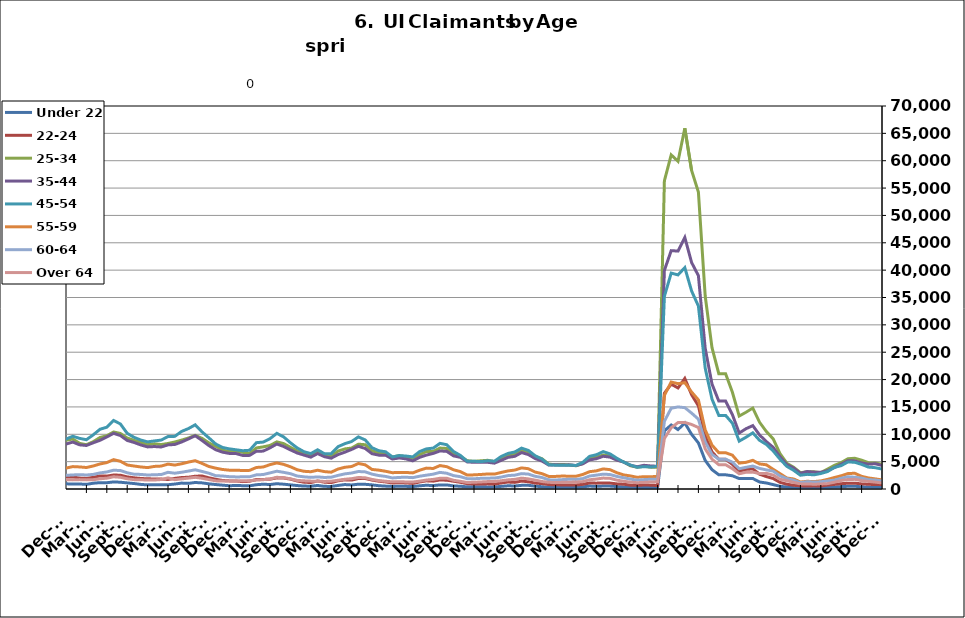
| Category | Under 22 | 22-24 | 25-34 | 35-44 | 45-54 | 55-59 | 60-64 | Over 64 |
|---|---|---|---|---|---|---|---|---|
| 1995-02-28 | 535 | 933 | 5740 | 6206 | 4029 | 1255 | 625 | 276 |
| 1995-03-31 | 534 | 992 | 5856 | 6433 | 4297 | 1294 | 686 | 323 |
| 1995-04-30 | 603 | 1125 | 6814 | 6965 | 4447 | 1392 | 730 | 338 |
| 1995-05-31 | 626 | 1171 | 7442 | 7404 | 4702 | 1383 | 751 | 333 |
| 1995-06-30 | 625 | 1218 | 7514 | 7778 | 4867 | 1435 | 813 | 366 |
| 1995-07-31 | 710 | 1296 | 8612 | 8864 | 5537 | 1595 | 891 | 407 |
| 1995-08-31 | 729 | 1248 | 8185 | 8719 | 5400 | 1604 | 982 | 406 |
| 1995-09-30 | 578 | 1028 | 6615 | 7150 | 4534 | 1351 | 862 | 338 |
| 1995-10-31 | 554 | 957 | 5805 | 6461 | 4159 | 1205 | 741 | 287 |
| 1995-11-30 | 468 | 845 | 5201 | 5826 | 3927 | 1155 | 702 | 254 |
| 1995-12-31 | 517 | 858 | 5350 | 5974 | 4010 | 1153 | 672 | 263 |
| 1996-01-31 | 543 | 927 | 5431 | 6086 | 4208 | 1221 | 685 | 301 |
| 1996-02-29 | 617 | 999 | 5667 | 6535 | 4480 | 1312 | 747 | 305 |
| 1996-03-31 | 622 | 981 | 5896 | 6557 | 4514 | 1362 | 763 | 306 |
| 1996-04-30 | 680 | 1140 | 7032 | 7649 | 5088 | 1527 | 856 | 345 |
| 1996-05-31 | 689 | 1163 | 7220 | 7819 | 5070 | 1521 | 832 | 366 |
| 1996-06-30 | 661 | 1145 | 7344 | 8173 | 5391 | 1568 | 844 | 388 |
| 1996-07-31 | 762 | 1250 | 8375 | 9181 | 6036 | 1755 | 973 | 432 |
| 1996-08-31 | 746 | 1145 | 7829 | 8585 | 5586 | 1651 | 950 | 435 |
| 1996-09-30 | 635 | 992 | 6399 | 7097 | 4790 | 1462 | 804 | 425 |
| 1996-10-31 | 572 | 851 | 5448 | 6291 | 4192 | 1259 | 693 | 340 |
| 1996-11-30 | 531 | 827 | 5003 | 5921 | 3908 | 1153 | 602 | 315 |
| 1996-12-31 | 521 | 789 | 4710 | 5510 | 3673 | 1110 | 610 | 284 |
| 1997-01-31 | 559 | 841 | 5203 | 6172 | 4321 | 1255 | 731 | 328 |
| 1997-02-28 | 556 | 841 | 5187 | 6162 | 4311 | 1250 | 727 | 326 |
| 1997-03-31 | 499 | 806 | 5125 | 6037 | 4176 | 1294 | 702 | 363 |
| 1997-04-30 | 545 | 885 | 5753 | 6709 | 4248 | 1339 | 734 | 339 |
| 1997-05-31 | 612 | 941 | 6146 | 7153 | 4458 | 1348 | 801 | 336 |
| 1997-06-30 | 623 | 995 | 6240 | 7298 | 4662 | 1302 | 776 | 348 |
| 1997-07-31 | 716 | 1154 | 7168 | 8554 | 5489 | 1509 | 903 | 415 |
| 1997-08-31 | 684 | 1072 | 6853 | 8093 | 5222 | 1487 | 837 | 416 |
| 1997-09-30 | 579 | 912 | 5522 | 6592 | 4348 | 1285 | 705 | 380 |
| 1997-10-31 | 516 | 817 | 4894.5 | 5892.5 | 3945 | 1159 | 625 | 344.5 |
| 1997-11-30 | 453 | 722 | 4267 | 5193 | 3542 | 1033 | 545 | 309 |
| 1997-12-31 | 413 | 682 | 3792 | 4755 | 3300 | 1023 | 490 | 266 |
| 1998-01-31 | 489 | 741 | 4044 | 5115 | 3513 | 1099 | 525 | 267 |
| 1998-02-28 | 435 | 684 | 3864 | 4903 | 3549 | 1043 | 571 | 285 |
| 1998-03-31 | 416 | 680 | 3855 | 5086 | 3703 | 1176 | 604 | 297 |
| 1998-04-30 | 592 | 813 | 5092 | 6219 | 4262 | 1336 | 688 | 332 |
| 1998-05-31 | 579 | 849 | 5319 | 6766 | 4554 | 1382 | 729 | 360 |
| 1998-06-30 | 568 | 899 | 5557 | 7101 | 4897 | 1405 | 783 | 367 |
| 1998-07-31 | 691 | 1031 | 6472 | 8095 | 5562 | 1589 | 880 | 392 |
| 1998-08-31 | 673 | 1007 | 6326 | 7950 | 5369 | 1574 | 935 | 393 |
| 1998-09-30 | 548 | 838 | 5206 | 6768 | 4703 | 1432 | 849 | 373 |
| 1998-10-31 | 496 | 776 | 4437 | 5582 | 3875 | 1250 | 711 | 302 |
| 1998-11-30 | 456 | 761 | 4182 | 5332 | 4015 | 1296 | 694 | 308 |
| 1998-12-31 | 442 | 722 | 4010 | 5198 | 4062 | 1331 | 656 | 290 |
| 1999-01-31 | 503 | 830 | 4502 | 5761 | 4521 | 1490 | 751 | 297 |
| 1999-02-28 | 463 | 756 | 4267 | 5576 | 4431 | 1470 | 767 | 301 |
| 1999-03-31 | 435 | 688 | 4119 | 5519 | 4403 | 1516 | 765 | 331 |
| 1999-04-30 | 591 | 949 | 5292 | 7089 | 5468 | 1724 | 914 | 489 |
| 1999-05-31 | 674 | 911 | 5611 | 7459 | 5457 | 1710 | 934 | 500 |
| 1999-06-30 | 640 | 906 | 5660 | 7503 | 5333 | 1695 | 920 | 495 |
| 1999-07-31 | 766 | 1132 | 6820 | 9256 | 6620 | 1981 | 1001 | 549 |
| 1999-08-31 | 738 | 1117 | 6737 | 9030 | 6670 | 2019 | 1075 | 582 |
| 1999-09-30 | 600 | 968 | 5167 | 7169 | 5458 | 1712 | 892 | 465 |
| 1999-10-31 | 494 | 813 | 4501 | 6048 | 4682 | 1443 | 743 | 363 |
| 1999-11-30 | 464 | 768 | 4228 | 5593 | 4564 | 1392 | 702 | 313 |
| 1999-12-31 | 468.5 | 754.5 | 4149 | 5486.5 | 4505 | 1429 | 673 | 304 |
| 2000-01-31 | 473 | 741 | 4070 | 5380 | 4446 | 1466 | 644 | 295 |
| 2000-02-29 | 460 | 691 | 3807 | 5357 | 4470 | 1469 | 707 | 310 |
| 2000-03-31 | 412 | 652 | 3864 | 5499 | 4568 | 1508 | 816 | 389 |
| 2000-04-30 | 585 | 829 | 4741 | 6891 | 5127 | 1631 | 906 | 451 |
| 2000-05-31 | 627 | 875 | 5086 | 7211 | 5238 | 1598 | 956 | 489 |
| 2000-06-30 | 675 | 983 | 5624 | 7826 | 5562 | 1669 | 941 | 524 |
| 2000-07-31 | 802 | 1109 | 6475 | 9102 | 6450 | 1927 | 1097 | 594 |
| 2000-08-31 | 787 | 1058 | 6045 | 8732 | 6157 | 1894 | 1085 | 616 |
| 2000-09-30 | 607 | 897 | 4766 | 6864 | 5037 | 1486 | 902 | 479 |
| 2000-10-31 | 544 | 760 | 4267 | 5897 | 4465 | 1323 | 762 | 394 |
| 2000-11-30 | 535 | 797 | 3982 | 5439 | 4318 | 1256 | 702 | 396 |
| 2000-12-31 | 508 | 832 | 3891 | 5255 | 4218 | 1246 | 694 | 361 |
| 2001-01-31 | 627 | 892 | 4229 | 5724 | 4777 | 1300 | 721 | 393 |
| 2001-02-28 | 643 | 934 | 4553 | 6302 | 5224 | 1529 | 849 | 472 |
| 2001-03-31 | 412 | 648 | 3625 | 5081 | 4551 | 1413 | 778 | 440 |
| 2001-04-30 | 875 | 1276 | 6577 | 8914 | 7196 | 2144 | 1185 | 639 |
| 2001-05-31 | 944 | 1399 | 7133 | 9570 | 7651 | 2265 | 1231 | 679 |
| 2001-06-30 | 1041 | 1584 | 8072 | 11034 | 8621 | 2613 | 1398 | 756 |
| 2001-07-31 | 1135 | 1806 | 9038 | 12514 | 9691 | 2970 | 1611 | 848 |
| 2001-08-31 | 1116 | 1776 | 8753 | 12045 | 9560 | 2963 | 1691 | 898 |
| 2001-09-30 | 1046 | 1705 | 8118 | 11025 | 8788 | 2784 | 1608 | 833 |
| 2001-10-31 | 1094 | 1785 | 8459 | 11114 | 8850 | 2772 | 1610 | 777 |
| 2001-11-30 | 1154 | 1931 | 9131 | 11576 | 9447 | 2973 | 1661 | 778 |
| 2001-12-31 | 1280 | 2191 | 9917 | 11961 | 9905 | 3152 | 1740 | 780 |
| 2002-01-31 | 1330 | 2255 | 10364 | 12730 | 10592 | 3378 | 1843 | 821 |
| 2002-02-28 | 1347 | 2339 | 10349 | 12730 | 10784 | 3499 | 1861 | 867 |
| 2002-03-31 | 1266 | 2231 | 9963 | 12747 | 10614 | 3499 | 1867 | 979 |
| 2002-04-30 | 1412 | 2488 | 11603 | 15825 | 13571 | 4631 | 2389 | 1146 |
| 2002-05-31 | 1455 | 2421 | 11243 | 15509 | 13148 | 4374 | 2359 | 1195 |
| 2002-06-30 | 1534 | 2479 | 11416 | 15594 | 13261 | 4343 | 2365 | 1180 |
| 2002-07-31 | 1513 | 2614 | 11895 | 16242 | 13727 | 4439 | 2428 | 1255 |
| 2002-08-31 | 1022 | 1977 | 8719 | 12054 | 10588 | 3454 | 1990 | 1047 |
| 2002-09-30 | 1391 | 2528 | 10478 | 14010 | 12008 | 3847 | 2161 | 1166 |
| 2002-10-31 | 1401 | 2385 | 9826 | 12727 | 10778 | 3498 | 1886 | 973 |
| 2002-11-30 | 1344 | 2390 | 9846 | 12059 | 10297 | 3367 | 1833 | 958 |
| 2002-12-31 | 1311 | 2403 | 9841 | 11670 | 10177 | 3369 | 1871 | 894 |
| 2003-01-31 | 1311 | 2403 | 9841 | 11670 | 10177 | 3369 | 1871 | 894 |
| 2003-02-28 | 1367 | 2275 | 9730 | 12433 | 10806 | 3687 | 2016 | 974 |
| 2003-03-31 | 1367 | 2357 | 9844 | 12620 | 11167 | 3825 | 2151 | 1094 |
| 2003-04-30 | 1549 | 2525 | 10619 | 14142 | 12182 | 4004 | 2304 | 1190 |
| 2003-05-31 | 1663 | 2698 | 10843 | 14795 | 12539 | 4102 | 2395 | 1256 |
| 2003-06-30 | 1755 | 2770 | 11350 | 15575 | 13251 | 4301 | 2493 | 1325 |
| 2003-07-31 | 1748 | 2791 | 11577 | 15863 | 13772 | 4465 | 2593 | 1371 |
| 2003-08-31 | 1718 | 2653 | 10998 | 15261 | 13219 | 4325 | 2522 | 1359 |
| 2003-09-30 | 1494 | 2521 | 10071 | 13565 | 11659 | 3828 | 2278 | 1286 |
| 2003-10-31 | 1329 | 2432 | 9388 | 12107 | 10693 | 3567 | 2036 | 1129 |
| 2003-11-30 | 1191 | 2226 | 8954 | 11297 | 10037 | 3414 | 2004 | 1068 |
| 2003-12-31 | 1206 | 2184 | 8530 | 10413 | 9335 | 3215 | 1854 | 994 |
| 2004-01-31 | 1216 | 2171 | 8382 | 9858 | 8955 | 2992 | 1736 | 963 |
| 2004-02-29 | 1118 | 1879 | 7614 | 8935 | 8176 | 2761 | 1617 | 943 |
| 2004-03-31 | 1099 | 1749 | 7152 | 8565 | 7769 | 2686 | 1608 | 981 |
| 2004-04-30 | 1241 | 1951 | 7653 | 9981 | 8741 | 2872 | 1685 | 1056 |
| 2004-05-31 | 1245 | 1934 | 7651 | 10203 | 8820 | 2928 | 1703 | 1079 |
| 2004-06-30 | 1316 | 2086 | 8172 | 10636 | 9362 | 3146 | 1843 | 1081 |
| 2004-07-31 | 1476 | 2265 | 8795 | 11511 | 10439 | 3497 | 2008 | 1171 |
| 2004-08-31 | 1390 | 2055 | 8008 | 10418 | 9514 | 3304 | 1909 | 1105 |
| 2004-09-30 | 1129 | 1820 | 6987 | 8661 | 7694 | 2755 | 1623 | 1046 |
| 2004-10-31 | 1037 | 1675 | 6590 | 7964 | 7029 | 2459 | 1461 | 882 |
| 2004-11-30 | 954 | 1638 | 6342 | 7570 | 6733 | 2294 | 1383 | 841 |
| 2004-12-31 | 857 | 1533 | 5921 | 6991 | 6333 | 2225 | 1287 | 764 |
| 2005-01-31 | 893 | 1539 | 6047 | 7410 | 6682 | 2253 | 1274 | 788 |
| 2005-02-28 | 846 | 1361 | 5650 | 6952 | 6404 | 2198 | 1326 | 786 |
| 2005-03-31 | 747 | 1258 | 5313 | 6595 | 6251 | 2151 | 1327 | 742 |
| 2005-04-30 | 877 | 1375 | 5696 | 7717 | 7230 | 2440 | 1401 | 844 |
| 2005-05-31 | 854 | 1408 | 5674 | 7905 | 7454 | 2482 | 1453 | 858 |
| 2005-06-30 | 819 | 1444 | 6028 | 8565 | 7899 | 2613 | 1547 | 890 |
| 2005-07-31 | 900 | 1461 | 6395 | 9124 | 8614 | 2864 | 1640 | 1004 |
| 2005-08-31 | 805 | 1439 | 5917 | 8271 | 8076 | 2692 | 1587 | 945 |
| 2005-09-30 | 631 | 1209 | 4978 | 6413 | 6203 | 2116 | 1312 | 724 |
| 2005-10-31 | 638 | 1134 | 4602 | 6028 | 5688 | 1997 | 1171 | 656 |
| 2005-11-30 | 564 | 1071 | 4409 | 5563 | 5105 | 1791 | 1035 | 580 |
| 2005-12-31 | 523 | 987 | 4014 | 4983 | 4531 | 1673 | 968 | 546 |
| 2006-01-31 | 531 | 925 | 3900 | 5012 | 4793 | 1691 | 1008 | 539 |
| 2006-02-28 | 447 | 804 | 3534 | 4388 | 4403 | 1586 | 980 | 549 |
| 2006-03-31 | 399 | 785 | 3455 | 4472 | 4584 | 1680 | 1069 | 618 |
| 2006-04-30 | 527 | 945 | 4004 | 5859 | 5921 | 1965 | 1251 | 744 |
| 2006-05-31 | 594 | 964 | 4205 | 6365 | 6369 | 2156 | 1327 | 792 |
| 2006-06-30 | 660 | 1113 | 4742 | 7052 | 7094 | 2386 | 1474 | 933 |
| 2006-07-31 | 771 | 1183 | 5214 | 7974 | 8007 | 2685 | 1635 | 1072 |
| 2006-08-31 | 737 | 1202 | 5116 | 7524 | 7553 | 2671 | 1590 | 1019 |
| 2006-09-30 | 596 | 1086 | 4608 | 6175 | 6389 | 2256 | 1287 | 812 |
| 2006-10-31 | 596 | 1056 | 4585 | 5758 | 5788 | 2026 | 1164 | 696 |
| 2006-11-30 | 542 | 1003 | 4370 | 5304 | 5388 | 1812 | 1082 | 604 |
| 2006-12-31 | 553 | 1102 | 4425 | 5291 | 5310 | 1801 | 1099 | 603 |
| 2007-01-31 | 587 | 1147 | 4542 | 5619 | 5506 | 1920 | 1174 | 663 |
| 2007-02-28 | 544 | 1090 | 4490 | 5562 | 5616 | 1982 | 1260 | 705 |
| 2007-03-31 | 558 | 1089 | 4498 | 5595 | 5708 | 2016 | 1378 | 717 |
| 2007-04-30 | 760 | 1203 | 5015 | 6827 | 6871 | 2316 | 1536 | 856 |
| 2007-05-31 | 806 | 1285 | 5542 | 7679 | 7763 | 2571 | 1719 | 1021 |
| 2007-06-30 | 862 | 1340 | 6100 | 8324 | 8341 | 2812 | 1896 | 1060 |
| 2007-07-31 | 980 | 1524 | 6616 | 9184 | 9522 | 3226 | 2038 | 1250 |
| 2007-08-31 | 950 | 1510 | 6266 | 8359 | 8842 | 3033 | 1949 | 1157 |
| 2007-09-30 | 865 | 1595 | 6213 | 7798 | 7957 | 2790 | 1816 | 1090 |
| 2007-10-31 | 883 | 1517 | 6214 | 7229 | 7503 | 2574 | 1630 | 978 |
| 2007-11-15 | 816 | 1424 | 5981 | 6740 | 6999 | 2468 | 1510 | 860 |
| 2007-12-15 09:36:00 | 851 | 1536 | 6411 | 6986 | 7174 | 2572 | 1584 | 874 |
| 2008-01-14 19:12:00 | 963 | 1628 | 6836 | 7533 | 7742 | 2786 | 1744 | 940 |
| 2008-02-14 04:48:00 | 982 | 1565 | 6847 | 7767 | 8031 | 2958 | 1823 | 985 |
| 2008-03-15 14:24:00 | 1029 | 1666 | 7210 | 8036 | 8353 | 3105 | 1898 | 1085 |
| 2008-04-15 | 1182 | 1889 | 7894 | 9339 | 9822 | 3537 | 2184 | 1246 |
| 2008-05-15 09:36:00 | 1325 | 2099 | 8651 | 10315 | 11003 | 3871 | 2423 | 1448 |
| 2008-06-14 19:12:00 | 1405 | 2238 | 9567 | 11330 | 12040 | 4322 | 2650 | 1572 |
| 2008-07-15 04:48:00 | 1616 | 2488 | 10336 | 12349 | 13396 | 4698 | 3083 | 1801 |
| 2008-08-14 14:24:00 | 1753 | 2665 | 10716 | 12486 | 13444 | 4795 | 3139 | 1802 |
| 2008-09-14 | 1800 | 2924 | 11552 | 12686 | 13602 | 4801 | 3180 | 1811 |
| 2008-10-14 09:36:00 | 1936 | 3131 | 12284 | 13322 | 13831 | 4989 | 3183 | 1808 |
| 2008-11-13 19:12:00 | 2093 | 3414 | 13577 | 14724 | 15130 | 5413 | 3440 | 1946 |
| 2008-12-14 04:48:00 | 2495 | 4020 | 15380 | 16325 | 16846 | 6098 | 3755 | 2155 |
| 2009-01-13 14:24:00 | 3054 | 4678 | 17678 | 18452 | 19095 | 6788 | 4182 | 2364 |
| 2009-02-13 | 3531 | 5304 | 19793 | 20788 | 21601 | 7727 | 4836 | 2718 |
| 2009-03-15 09:36:00 | 3891 | 5925 | 22303 | 23139 | 24352 | 8876 | 5515 | 3141 |
| 2009-04-14 19:12:00 | 4291 | 6403 | 23925 | 25362 | 26817 | 9618 | 6020 | 3494 |
| 2009-05-15 04:48:00 | 4410 | 6521 | 24301 | 25794 | 27238 | 9735 | 6181 | 3529 |
| 2009-06-14 14:24:00 | 4405 | 6853 | 25234 | 26806 | 28296 | 10256 | 6673 | 3804 |
| 2009-07-15 | 4729 | 7280 | 26132 | 27836 | 29724 | 10830 | 6950 | 4125 |
| 2009-08-14 09:36:00 | 4717 | 7069 | 25281 | 26184 | 27877 | 10164 | 6719 | 3918 |
| 2009-09-13 19:12:00 | 4741 | 7291 | 25029 | 24981 | 26018 | 9679 | 6210 | 3594 |
| 2009-10-14 04:48:00 | 4656 | 7051 | 24241 | 23779 | 24730 | 9034 | 5817 | 3422 |
| 2009-11-13 14:24:00 | 4421 | 6817 | 23760 | 22851 | 23515 | 8627 | 5549 | 3297 |
| 2009-12-14 | 4232 | 6586 | 23118 | 22038 | 22501 | 8496 | 5370 | 3295 |
| 2010-01-13 09:36:00 | 4276 | 6583 | 22706 | 21421 | 22132 | 8135 | 5154 | 3134 |
| 2010-02-12 19:12:00 | 4133 | 6142 | 21386 | 20012 | 21036 | 7728 | 5039 | 3047 |
| 2010-03-15 04:48:00 | 3784 | 5822 | 20418 | 19073 | 20556 | 7446 | 4983 | 3062 |
| 2010-04-14 14:24:00 | 3731 | 5751 | 20058 | 19261 | 21012 | 7449 | 5078 | 2936 |
| 2010-05-15 | 3516 | 5553 | 19393 | 18793 | 20409 | 7213 | 4923 | 2915 |
| 2010-06-14 09:36:00 | 3450 | 5640 | 19615 | 19385 | 20781 | 7547 | 5293 | 3043 |
| 2010-07-14 19:12:00 | 3536 | 5781 | 19820 | 19714 | 21269 | 7946 | 5439 | 3330 |
| 2010-08-14 04:48:00 | 3477 | 5590 | 18902 | 18548 | 19686 | 7561 | 5039 | 3181 |
| 2010-09-13 14:24:00 | 3083 | 5332 | 17344 | 16712 | 17408 | 6775 | 4612 | 2859 |
| 2010-10-14 | 3004 | 5138 | 17187 | 16492 | 17042 | 6713 | 4418 | 2779 |
| 2010-11-13 09:36:00 | 2724 | 4771 | 16387 | 15438 | 16061 | 6360 | 4209 | 2601 |
| 2010-12-13 19:12:00 | 2335 | 4159 | 15175 | 14143 | 14646 | 5823 | 4003 | 2480 |
| 2011-01-13 04:48:00 | 2530 | 4343 | 15492 | 14596 | 15561 | 6250 | 4059 | 2487 |
| 2011-02-12 14:24:00 | 2609 | 4202 | 15131 | 14142 | 15320 | 6044 | 4041 | 2517 |
| 2011-03-15 | 2290 | 3998 | 14370 | 13505 | 14523 | 5925 | 3990 | 2470 |
| 2011-04-14 09:36:00 | 2563 | 4190 | 14834 | 14445 | 15508 | 6130 | 3916 | 2488 |
| 2011-05-14 19:12:00 | 2642 | 4217 | 14917 | 14494 | 16051 | 6156 | 4129 | 2602 |
| 2011-06-14 04:48:00 | 2767 | 4676 | 17673 | 17404 | 19563 | 7763 | 5398 | 3653 |
| 2011-07-14 14:24:00 | 3027 | 4815 | 17530 | 17197 | 19880 | 7870 | 5384 | 3686 |
| 2011-08-14 | 2900 | 4498 | 15970 | 15020 | 17035 | 6697 | 4394 | 2956 |
| 2011-09-13 09:36:00 | 2531 | 4156 | 14609 | 13818 | 15092 | 5903 | 3881 | 2687 |
| 2011-10-13 19:12:00 | 2452 | 3959 | 14501 | 13415 | 14565 | 5635 | 3734 | 2491 |
| 2011-11-13 04:48:00 | 2197 | 3615 | 13732 | 12410 | 13698 | 5345 | 3574 | 2339 |
| 2011-12-13 14:24:00 | 1938 | 3290 | 13130 | 11646 | 13054 | 5089 | 3380 | 2177 |
| 2012-01-13 | 2098 | 3424 | 13293 | 11897 | 13400 | 5218 | 3448 | 2197 |
| 2012-02-12 09:36:00 | 2047 | 3428 | 12569 | 11400 | 12931 | 5177 | 3445 | 2212 |
| 2012-03-13 19:12:00 | 1870 | 3252 | 11913 | 10922 | 12476 | 4948 | 3317 | 2155 |
| 2012-04-13 04:48:00 | 2063 | 3590 | 12479 | 11814 | 13464 | 5278 | 3509 | 2287 |
| 2012-05-13 14:24:00 | 2260 | 3828 | 12852 | 12063 | 14139 | 5562 | 3628 | 2485 |
| 2012-06-13 | 2147 | 3747 | 13008 | 12659 | 14694 | 5791 | 3902 | 2736 |
| 2012-07-13 09:36:00 | 2358 | 4087 | 14109 | 13412 | 15770 | 6346 | 4156 | 3086 |
| 2012-08-12 19:12:00 | 1887 | 3284 | 11852 | 11102 | 13153 | 5396 | 3487 | 2583 |
| 2012-09-12 04:48:00 | 1524 | 2903 | 10742 | 10051 | 11393 | 4726 | 3103 | 2327 |
| 2012-10-12 14:24:00 | 1289 | 2603 | 10123 | 9339 | 10510 | 4405 | 2813 | 2032 |
| 2012-11-12 | 945 | 2155 | 8870 | 8273 | 9193 | 3781 | 2520 | 1702 |
| 2012-12-12 09:36:00 | 937 | 2201 | 8913 | 8210 | 9124 | 3816 | 2491 | 1722 |
| 2013-01-11 19:12:00 | 934 | 2199 | 9132 | 8579 | 9635 | 4095 | 2569 | 1667 |
| 2013-02-11 04:48:00 | 915 | 1996 | 8343 | 8072 | 9253 | 4034 | 2623 | 1715 |
| 2013-03-13 14:24:00 | 845 | 1934 | 8092 | 7955 | 9007 | 3929 | 2561 | 1667 |
| 2013-04-13 | 1055 | 2124 | 8637 | 8445 | 9891 | 4204 | 2666 | 1698 |
| 2013-05-13 09:36:00 | 1160 | 2394 | 9413 | 8898 | 10920 | 4574 | 2940 | 1871 |
| 2013-06-12 19:12:00 | 1145 | 2351 | 9732 | 9510 | 11293 | 4830 | 3115 | 1976 |
| 2013-07-13 04:48:00 | 1294 | 2558 | 10421 | 10174 | 12520 | 5363 | 3434 | 2233 |
| 2013-08-12 14:24:00 | 1238 | 2519 | 10150 | 9771 | 11886 | 5067 | 3372 | 2140 |
| 2013-09-12 | 1116 | 2214 | 9323 | 8874 | 10178 | 4389 | 2964 | 1871 |
| 2013-10-12 09:36:00 | 1000 | 2044 | 8893 | 8509 | 9449 | 4200 | 2701 | 1709 |
| 2013-11-11 19:12:00 | 842 | 1927 | 8532 | 8049 | 8950 | 4028 | 2665 | 1675 |
| 2013-12-12 04:48:00 | 753 | 1854 | 8098 | 7692 | 8612 | 3913 | 2557 | 1655 |
| 2014-01-11 14:24:00 | 788 | 1846 | 8270 | 7762 | 8786 | 4128 | 2606 | 1642 |
| 2014-02-11 | 795 | 1817 | 8124 | 7677 | 8944 | 4189 | 2646 | 1728 |
| 2014-03-13 09:36:00 | 782 | 1741 | 8319 | 8063 | 9583 | 4550 | 3048 | 2040 |
| 2014-04-12 19:12:00 | 905 | 1940 | 8594 | 8138 | 9620 | 4372 | 2886 | 1706 |
| 2014-05-13 04:48:00 | 1079 | 2093 | 8933 | 8593 | 10522 | 4609 | 3062 | 1850 |
| 2014-06-12 14:24:00 | 1028 | 2152 | 9323 | 9148 | 11040 | 4920 | 3274 | 1985 |
| 2014-07-13 | 1189 | 2333 | 9808 | 9735 | 11729 | 5171 | 3509 | 2133 |
| 2014-08-14 | 1119 | 2379 | 9259 | 8876 | 10438 | 4678 | 3210 | 1962 |
| 2014-09-13 09:36:00 | 943 | 2048 | 8430 | 7946 | 9358 | 4119 | 2891 | 1734 |
| 2014-10-13 19:12:00 | 816 | 1781 | 7821 | 7185 | 8244 | 3813 | 2437 | 1486 |
| 2014-11-13 04:48:00 | 703 | 1557 | 7150 | 6736 | 7594 | 3571 | 2374 | 1466 |
| 2014-12-13 14:24:00 | 597 | 1482 | 6833 | 6507 | 7340 | 3442 | 2255 | 1458 |
| 2015-01-13 | 646 | 1466 | 6927 | 6477 | 7168 | 3432 | 2210 | 1429 |
| 2015-02-12 09:36:00 | 607 | 1346 | 6696 | 6134 | 6999 | 3383 | 2220 | 1525 |
| 2015-03-14 19:12:00 | 577 | 1416 | 6499 | 6145 | 7077 | 3405 | 2233 | 1530 |
| 2015-04-14 04:48:00 | 784 | 1736 | 7505 | 6901 | 8468 | 3935 | 2586 | 1624 |
| 2015-05-14 14:24:00 | 875 | 1749 | 7696 | 6925 | 8578 | 4020 | 2644 | 1698 |
| 2015-06-14 | 818 | 1789 | 7961 | 7519 | 9200 | 4452 | 2943 | 1839 |
| 2015-07-14 09:36:00 | 966 | 2033 | 8609 | 8223 | 10167 | 4766 | 3254 | 2136 |
| 2015-08-13 19:12:00 | 880 | 2007 | 8302 | 7779 | 9530 | 4503 | 3045 | 2073 |
| 2015-09-13 04:48:00 | 752 | 1807 | 7615 | 7153 | 8455 | 4067 | 2798 | 1870 |
| 2015-10-13 14:24:00 | 630 | 1461 | 6995 | 6578 | 7509 | 3519 | 2375 | 1570 |
| 2015-11-13 | 533 | 1246 | 6491 | 6196 | 6815 | 3237 | 2224 | 1493 |
| 2015-12-13 09:36:00 | 512 | 1179 | 6242 | 5823 | 6474 | 3158 | 2123 | 1439 |
| 2016-01-12 19:12:00 | 646 | 1466 | 6927 | 6477 | 7168 | 3432 | 2210 | 1429 |
| 2016-02-12 04:48:00 | 482 | 1246 | 6101 | 5912 | 6452 | 3180 | 2110 | 1385 |
| 2016-03-13 14:24:00 | 474 | 1170 | 6011 | 5629 | 6452 | 3073 | 2152 | 1420 |
| 2016-04-13 | 648 | 1494 | 6917 | 6287 | 7737 | 3648 | 2483 | 1600 |
| 2016-05-13 09:36:00 | 812 | 1670 | 7326 | 6725 | 8279 | 3967 | 2765 | 1776 |
| 2016-06-12 19:12:00 | 738 | 1622 | 7479 | 7230 | 8681 | 4111 | 2920 | 1886 |
| 2016-07-13 04:48:00 | 875 | 1919 | 8193 | 7814 | 9525 | 4662 | 3196 | 2105 |
| 2016-08-12 14:24:00 | 858 | 1920 | 8091 | 7407 | 8969 | 4420 | 3130 | 2050 |
| 2016-09-12 | 752 | 1632 | 6992 | 6450 | 7548 | 3573 | 2713 | 1747 |
| 2016-10-12 09:36:00 | 602 | 1423 | 6590 | 6190 | 6998 | 3448 | 2457 | 1544 |
| 2016-11-11 19:12:00 | 523 | 1296 | 6418 | 6179 | 6801 | 3241 | 2299 | 1410 |
| 2016-12-12 04:48:00 | 468 | 1096 | 5827 | 5472 | 5867 | 2981 | 2019 | 1311 |
| 2017-01-11 14:24:00 | 495 | 1150 | 6111 | 5679 | 6108 | 3035 | 2115 | 1342 |
| 2017-02-11 | 484 | 1109 | 5882 | 5500 | 6023 | 3023 | 2148 | 1289 |
| 2017-03-13 09:36:00 | 442 | 1015 | 5634 | 5148 | 5865 | 2942 | 2075 | 1278 |
| 2017-04-12 19:12:00 | 585 | 1285 | 6292 | 5783 | 6842 | 3434 | 2336 | 1435 |
| 2017-05-13 04:48:00 | 686 | 1492 | 6844 | 6200 | 7332 | 3817 | 2526 | 1637 |
| 2017-06-12 14:24:00 | 623 | 1435 | 6852 | 6505 | 7473 | 3751 | 2713 | 1754 |
| 2017-07-13 | 745 | 1658 | 7483 | 6953 | 8339 | 4284 | 3038 | 1964 |
| 2017-08-12 09:36:00 | 745 | 1605 | 7411 | 6880 | 8092 | 4080 | 2878 | 1966 |
| 2017-09-11 19:12:00 | 559 | 1420 | 6481 | 6045 | 6845 | 3511 | 2443 | 1591 |
| 2017-10-12 04:48:00 | 503 | 1224 | 5960 | 5790 | 6135 | 3181 | 2245 | 1400 |
| 2017-11-11 14:24:00 | 390 | 972 | 5167 | 4951 | 5077 | 2553 | 1887 | 1188 |
| 2017-12-12 | 413 | 914 | 5058 | 4876 | 5071 | 2585 | 1870 | 1226 |
| 2018-01-11 09:36:00 | 411 | 912 | 5154 | 4909 | 5000 | 2656 | 1952 | 1288 |
| 2018-02-10 19:12:00 | 383 | 940 | 5246 | 4884 | 5165 | 2743 | 1980 | 1355 |
| 2018-03-13 04:48:00 | 373 | 875 | 5018 | 4724 | 5075 | 2723 | 1999 | 1389 |
| 2018-04-12 14:24:00 | 478 | 1104 | 5584 | 5240 | 5944 | 3026 | 2179 | 1506 |
| 2018-05-13 | 586 | 1275 | 6280 | 5780 | 6500 | 3300 | 2452 | 1670 |
| 2018-06-12 09:36:00 | 554 | 1207 | 6302 | 5974 | 6766 | 3462 | 2534 | 1762 |
| 2018-07-12 19:12:00 | 666 | 1445 | 7024 | 6656 | 7473 | 3858 | 2810 | 1989 |
| 2018-08-12 04:48:00 | 671 | 1323 | 6823 | 6293 | 7046 | 3706 | 2722 | 1850 |
| 2018-09-11 14:24:00 | 518 | 1084 | 5965 | 5563 | 6066 | 3091 | 2318 | 1618 |
| 2018-10-12 | 419 | 985 | 5538 | 5106 | 5464 | 2806 | 2102 | 1367 |
| 2018-11-11 09:36:00 | 306 | 808 | 4542 | 4371 | 4433 | 2297 | 1673 | 1222 |
| 2018-12-11 19:12:00 | 328 | 771 | 4439 | 4429 | 4340 | 2303 | 1646 | 1174 |
| 2019-01-11 04:48:00 | 327 | 743 | 4491 | 4378 | 4359 | 2368 | 1715 | 1218 |
| 2019-02-10 14:24:00 | 338 | 739 | 4402 | 4415 | 4345 | 2337 | 1773 | 1237 |
| 2019-03-13 | 306 | 738 | 4246 | 4293 | 4304 | 2328 | 1756 | 1281 |
| 2019-04-12 09:36:00 | 396 | 850 | 4657 | 4603 | 4871 | 2655 | 1900 | 1347 |
| 2019-05-12 19:12:00 | 541 | 1092 | 5700 | 5319 | 5974 | 3169 | 2371 | 1690 |
| 2019-06-12 04:48:00 | 476 | 1070 | 5822 | 5537 | 6262 | 3317 | 2534 | 1820 |
| 2019-07-12 14:24:00 | 538 | 1114 | 6206 | 5980 | 6836 | 3673 | 2717 | 1996 |
| 2019-08-12 | 528 | 1084 | 6044 | 5828 | 6422 | 3535 | 2645 | 1942 |
| 2019-09-11 09:36:00 | 445 | 932 | 5379 | 5275 | 5630 | 2979 | 2299 | 1624 |
| 2019-10-11 19:12:00 | 372 | 877 | 4949 | 4938 | 4922 | 2579 | 2058 | 1418 |
| 2019-11-11 04:48:00 | 332 | 701 | 4242 | 4332 | 4379 | 2392 | 1809 | 1247 |
| 2019-12-11 14:24:00 | 261 | 663 | 3977 | 4071 | 3974 | 2137 | 1619 | 1150 |
| 2020-01-11 | 272 | 724 | 4153 | 4331 | 4085 | 2258 | 1715 | 1206 |
| 2020-02-10 09:36:00 | 274 | 704 | 3992 | 4211 | 4020 | 2226 | 1784 | 1286 |
| 2020-03-11 19:12:00 | 291 | 630 | 3985 | 4153 | 4136 | 2332 | 1794 | 1308 |
| 2020-04-11 04:48:00 | 10628 | 17510 | 56346 | 39970 | 35225 | 17140 | 12379 | 9237 |
| 2020-05-11 14:24:00 | 11700 | 19159 | 61067 | 43562 | 39459 | 19553 | 14765 | 11197 |
| 2020-06-11 | 10859 | 18470 | 59897 | 43484 | 39131 | 19246 | 15000 | 12140 |
| 2020-07-11 09:36:00 | 12066 | 20204 | 65924 | 45983 | 40459 | 19436 | 14870 | 12160 |
| 2020-08-10 19:12:00 | 9989 | 17237 | 58218 | 41395 | 36191 | 17725 | 13875 | 11793 |
| 2020-09-10 04:48:00 | 8425 | 15201 | 54260 | 38988 | 33440 | 16290 | 12758 | 11237 |
| 2020-10-10 14:24:00 | 5224 | 9693 | 35264 | 25722 | 22091 | 10801 | 8611 | 7331 |
| 2020-11-10 | 3533 | 6796 | 25816 | 19183 | 16424 | 8018 | 6314 | 5449 |
| 2020-12-10 09:36:00 | 2593 | 5424 | 21071 | 16063 | 13455 | 6630 | 5449 | 4436 |
| 2021-01-09 19:12:00 | 2593 | 5424 | 21071 | 16063 | 13455 | 6630 | 5449 | 4436 |
| 2021-02-09 04:48:00 | 2420 | 4500 | 17683 | 13595 | 12022 | 6183 | 4899 | 3716 |
| 2021-03-11 14:24:00 | 1905 | 3249 | 13332 | 10225 | 8752 | 4732 | 3708 | 2781 |
| 2021-04-11 | 1938 | 3581 | 14034 | 11018 | 9457 | 4873 | 3962 | 3063 |
| 2021-05-11 09:36:00 | 1918 | 3672 | 14797 | 11584 | 10265 | 5238 | 4196 | 3085 |
| 2021-06-10 19:12:00 | 1277 | 2699 | 12194 | 9866 | 8892 | 4577 | 3756 | 2811 |
| 2021-07-11 04:48:00 | 1101 | 2270 | 10491 | 8653 | 8141 | 4427 | 3493 | 2859 |
| 2021-08-10 14:24:00 | 802 | 1912 | 9154 | 7615 | 6945 | 3597 | 3259 | 2545 |
| 2021-09-10 | 499 | 1209 | 6458 | 5895 | 5459 | 2812 | 2399 | 1777 |
| 2021-10-10 09:36:00 | 363 | 875 | 4718 | 4474 | 4141 | 2009 | 1903 | 1513 |
| 2021-11-09 19:12:00 | 251 | 681 | 3999 | 3834 | 3423 | 1835 | 1611 | 1206 |
| 2021-12-10 04:48:00 | 194 | 580 | 2968 | 2881 | 2517 | 1278 | 1152 | 925 |
| 2022-01-09 14:24:00 | 189 | 547 | 3143 | 3194 | 2678 | 1410 | 1338 | 928 |
| 2022-02-09 | 183 | 575 | 3165 | 3086 | 2590 | 1357 | 1270 | 874 |
| 2022-03-11 09:36:00 | 219 | 541 | 2988 | 3043 | 2829 | 1476 | 1313 | 912 |
| 2022-04-10 19:12:00 | 308 | 723 | 3641 | 3357 | 3189 | 1758 | 1482 | 986 |
| 2022-05-11 04:48:00 | 365 | 837 | 4299 | 3915 | 3953 | 2098 | 1624 | 1241 |
| 2022-06-10 14:24:00 | 427 | 969 | 4818 | 4519 | 4269 | 2418 | 1965 | 1563 |
| 2022-07-11 | 494 | 1055 | 5515 | 5179 | 4951 | 2831 | 2235 | 1736 |
| 2022-08-10 09:36:00 | 499 | 1062 | 5638 | 5140 | 4881 | 2872 | 2150 | 1763 |
| 2022-09-09 19:12:00 | 403 | 928 | 5254 | 4761 | 4495 | 2315 | 1987 | 1537 |
| 2022-10-10 04:48:00 | 356 | 870 | 4804 | 4541 | 4005 | 2021 | 1701 | 1388 |
| 2022-11-09 14:24:00 | 318 | 806 | 4749 | 4616 | 3897 | 1850 | 1634 | 1258 |
| 2022-12-10 | 316 | 798 | 4526 | 4305 | 3649 | 1660 | 1473 | 1109 |